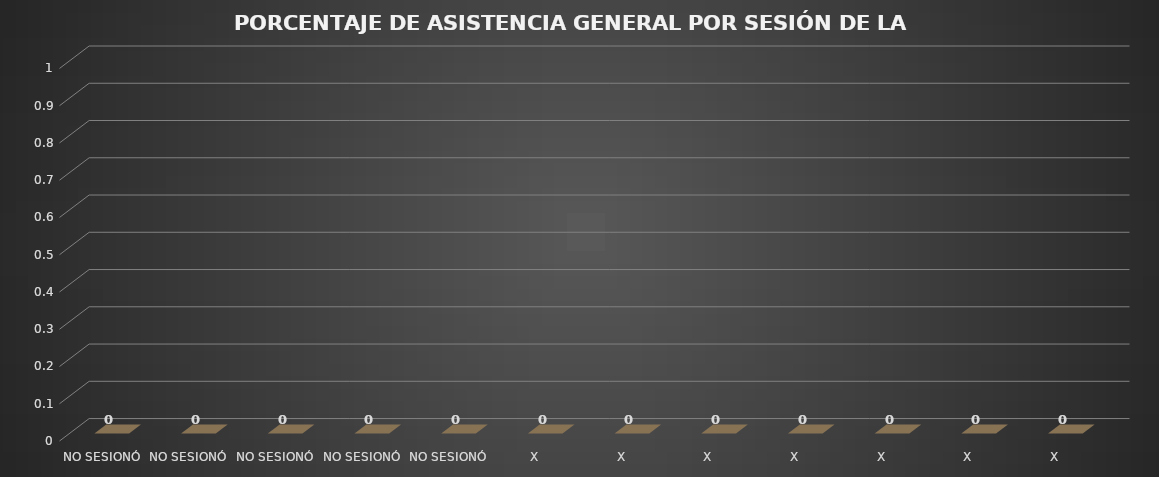
| Category | Series 0 |
|---|---|
| NO SESIONÓ | 0 |
| NO SESIONÓ | 0 |
| NO SESIONÓ | 0 |
| NO SESIONÓ | 0 |
| NO SESIONÓ | 0 |
| X | 0 |
| X | 0 |
| X | 0 |
| X | 0 |
| X | 0 |
| X | 0 |
| X | 0 |